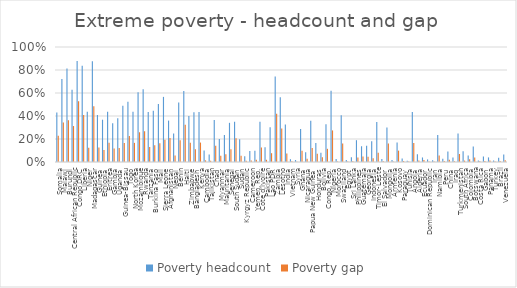
| Category | Poverty headcount | Poverty gap |
|---|---|---|
| Somalia | 0.43 | 0.228 |
| Malawi | 0.722 | 0.342 |
| Burundi | 0.813 | 0.364 |
| Central African Republic | 0.628 | 0.313 |
| Congo DRC | 0.877 | 0.528 |
| Liberia | 0.838 | 0.409 |
| Niger | 0.436 | 0.124 |
| Madagascar | 0.877 | 0.486 |
| Guinea | 0.409 | 0.127 |
| Ethiopia | 0.368 | 0.104 |
| Eritrea | 0.436 | 0.166 |
| Gambia | 0.336 | 0.117 |
| Uganda | 0.38 | 0.122 |
| Guinea-Bissau | 0.489 | 0.166 |
| Togo | 0.525 | 0.225 |
| North Korea | 0.436 | 0.166 |
| Mozambique | 0.607 | 0.258 |
| Rwanda | 0.632 | 0.266 |
| Tanzania | 0.435 | 0.13 |
| Burkina Faso | 0.446 | 0.147 |
| Mali | 0.504 | 0.164 |
| Sierra Leone | 0.566 | 0.192 |
| Afghanistan | 0.36 | 0.208 |
| Nepal | 0.248 | 0.056 |
| Benin | 0.518 | 0.188 |
| Haiti | 0.617 | 0.323 |
| Zimbabwe | 0.4 | 0.166 |
| Bangladesh | 0.432 | 0.112 |
| Kenya | 0.434 | 0.169 |
| Cambodia | 0.1 | 0.014 |
| Tajikistan | 0.066 | 0.012 |
| Chad | 0.365 | 0.142 |
| Myanmar | 0.2 | 0.055 |
| Mauritania | 0.234 | 0.068 |
| Senegal | 0.341 | 0.111 |
| South Sudan | 0.35 | 0.208 |
| Sudan | 0.198 | 0.055 |
| Kyrgyz Republic | 0.05 | 0.011 |
| Cameroon | 0.096 | 0.012 |
| Yemen, Rep. | 0.098 | 0.019 |
| Côte d'Ivoire | 0.35 | 0.127 |
| Pakistan | 0.127 | 0.019 |
| Lao PDR | 0.303 | 0.077 |
| Zambia | 0.744 | 0.419 |
| Lesotho | 0.562 | 0.292 |
| India | 0.327 | 0.075 |
| Vietnam | 0.024 | 0.006 |
| Syria | 0.017 | 0.002 |
| Ghana | 0.286 | 0.099 |
| Nicaragua | 0.085 | 0.029 |
| Papua New Guinea | 0.358 | 0.123 |
| Honduras | 0.165 | 0.072 |
| Bolivia | 0.08 | 0.042 |
| Congo, Rep. | 0.328 | 0.115 |
| Nigeria | 0.62 | 0.275 |
| Morocco | 0.025 | 0.005 |
| Swaziland | 0.406 | 0.16 |
| Egypt | 0.017 | 0.004 |
| Sri Lanka | 0.041 | 0.007 |
| Philippines | 0.19 | 0.04 |
| Guatemala | 0.137 | 0.048 |
| Georgia | 0.141 | 0.045 |
| Indonesia | 0.181 | 0.033 |
| Timor-Leste | 0.349 | 0.081 |
| El Salvador | 0.025 | 0.006 |
| Mongolia | 0.3 | 0.16 |
| Armenia | 0.018 | 0.003 |
| Kosovo | 0.17 | 0.099 |
| Paraguay | 0.03 | 0.01 |
| Tunisia | 0.011 | 0.004 |
| Angola | 0.434 | 0.164 |
| Algeria | 0.068 | 0.014 |
| Ecuador | 0.04 | 0.018 |
| Dominican Republic | 0.022 | 0.005 |
| Iran | 0.014 | 0.003 |
| Namibia | 0.235 | 0.057 |
| Peru | 0.029 | 0.008 |
| China | 0.092 | 0.02 |
| Iraq | 0.039 | 0.006 |
| Turkmenistan | 0.248 | 0.07 |
| South Africa | 0.094 | 0.012 |
| Colombia | 0.056 | 0.023 |
| Botswana | 0.134 | 0.04 |
| Costa Rica | 0.014 | 0.006 |
| Gabon | 0.048 | 0.009 |
| Panama | 0.04 | 0.013 |
| Turkey | 0.013 | 0.005 |
| Brazil | 0.038 | 0.01 |
| Venezuela | 0.066 | 0.014 |